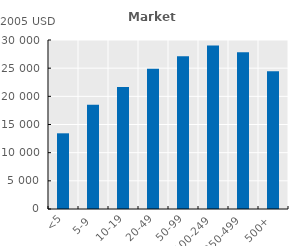
| Category | Series 0 |
|---|---|
| <5 | 13435.524 |
| 5-9 | 18512.404 |
| 10-19 | 21663.878 |
| 20-49 | 24914.287 |
| 50-99 | 27119.788 |
| 100-249 | 29038.892 |
| 250-499 | 27815.283 |
| 500+ | 24473.111 |